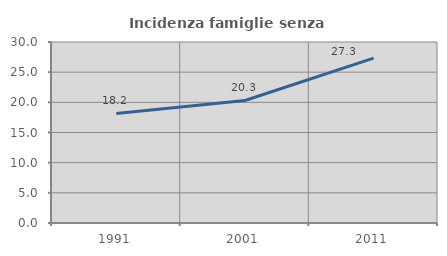
| Category | Incidenza famiglie senza nuclei |
|---|---|
| 1991.0 | 18.152 |
| 2001.0 | 20.31 |
| 2011.0 | 27.322 |